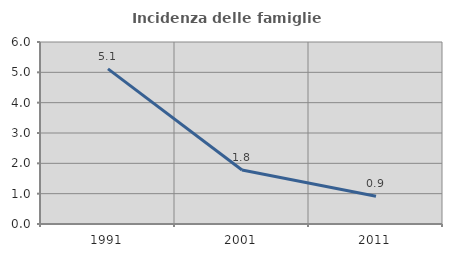
| Category | Incidenza delle famiglie numerose |
|---|---|
| 1991.0 | 5.113 |
| 2001.0 | 1.78 |
| 2011.0 | 0.912 |